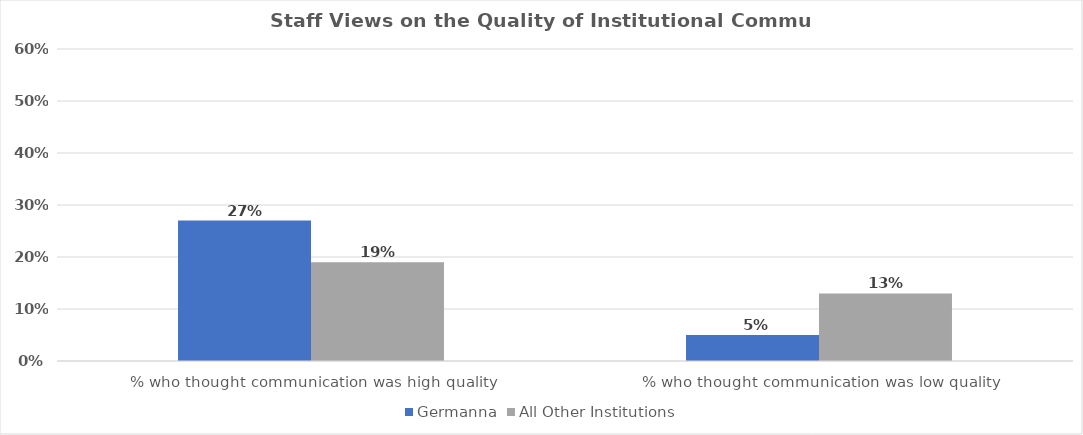
| Category | Germanna | All Other Institutions |
|---|---|---|
| % who thought communication was high quality | 0.27 | 0.19 |
| % who thought communication was low quality | 0.05 | 0.13 |